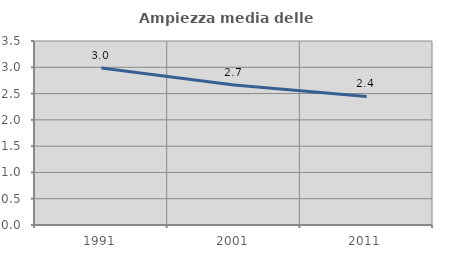
| Category | Ampiezza media delle famiglie |
|---|---|
| 1991.0 | 2.988 |
| 2001.0 | 2.661 |
| 2011.0 | 2.444 |